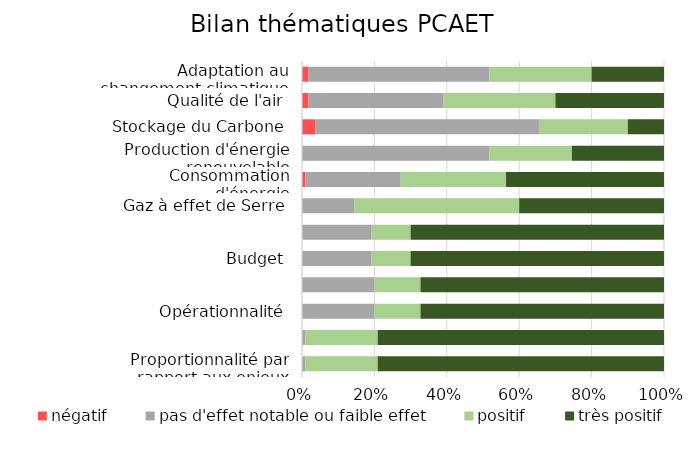
| Category | négatif | pas d'effet notable ou faible effet | positif | très positif |
|---|---|---|---|---|
| Proportionnalité par rapport aux enjeux | 0 | 1 | 22 | 87 |
|  | 0 | 0.009 | 0.2 | 0.791 |
| Opérationnalité | 0 | 22 | 14 | 74 |
|  | 0 | 0.2 | 0.127 | 0.673 |
| Budget | 0 | 21 | 12 | 77 |
|  | 0 | 0.191 | 0.109 | 0.7 |
| Gaz à effet de Serre | 0 | 16 | 50 | 44 |
| Consommation d'énergie | 1 | 29 | 32 | 48 |
| Production d'énergie renouvelable | 0 | 57 | 25 | 28 |
| Stockage du Carbone | 4 | 68 | 27 | 11 |
| Qualité de l'air | 2 | 41 | 34 | 33 |
| Adaptation au changement climatique | 2 | 55 | 31 | 22 |